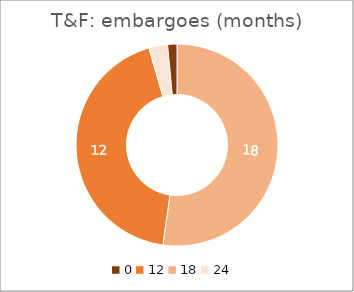
| Category | zero |
|---|---|
| 0 | 20 |